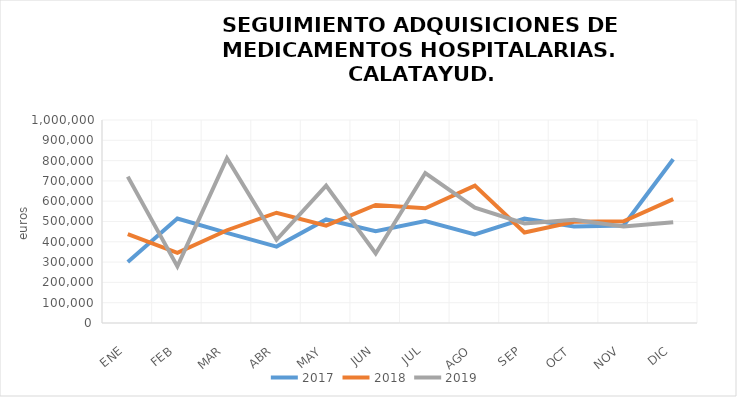
| Category | 2017 | 2018 | 2019 |
|---|---|---|---|
| ENE | 300130.53 | 437655.93 | 721213.96 |
| FEB | 514654.74 | 345800 | 278665.65 |
| MAR | 443892.14 | 456978.84 | 811533.76 |
| ABR | 376443.88 | 543228.13 | 409954.44 |
| MAY | 510114.7 | 479756.17 | 676844.78 |
| JUN | 452200.21 | 581430.67 | 342178.13 |
| JUL | 501749.84 | 565120.43 | 738969.45 |
| AGO | 435861 | 676700.51 | 568373.43 |
| SEP | 513986.97 | 445927.89 | 490642.19 |
| OCT | 475534.67 | 498567.18 | 508732.76 |
| NOV | 480793.68 | 501173.01 | 475590.82 |
| DIC | 806971.77 | 610214.45 | 496181.66 |